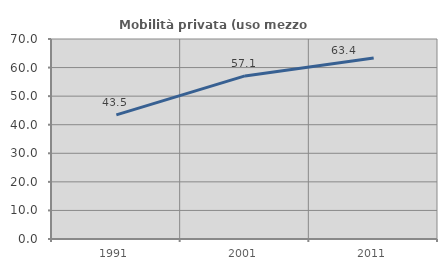
| Category | Mobilità privata (uso mezzo privato) |
|---|---|
| 1991.0 | 43.452 |
| 2001.0 | 57.089 |
| 2011.0 | 63.356 |